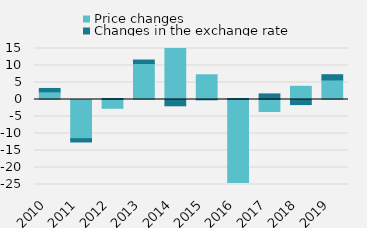
| Category | Price changes | Changes in the exchange rate |
|---|---|---|
| 0 | 2249 | 998 |
| 1 | -11518 | -976 |
| 2 | -2587 | 298 |
| 3 | 10585 | 1028 |
| 4 | 15437 | -1856 |
| 5 | 7277 | -94 |
| 6 | -24434 | 285 |
| 7 | -3527 | 1648 |
| 8 | 3882 | -1504 |
| 9 | 5744 | 1549 |